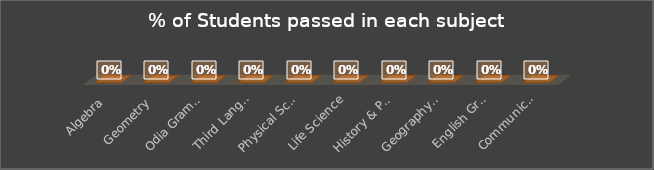
| Category | % of Students passed |
|---|---|
| Algebra | 0 |
| Geometry | 0 |
| Odia Grammar | 0 |
| Third Language-Sanskrit Grammar/Hindi Grammar(Optional) | 0 |
| Physical Science | 0 |
| Life Science | 0 |
| History & Political Science | 0 |
| Geography Economics | 0 |
| English Grammar | 0 |
| Communicative English | 0 |